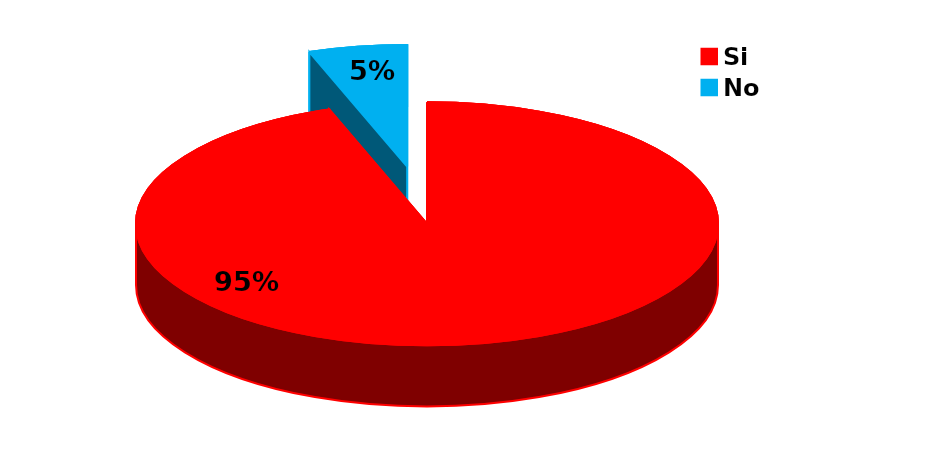
| Category | Series 0 |
|---|---|
| Si | 104 |
| No | 6 |